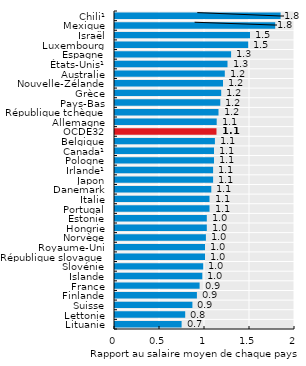
| Category | Series 0 |
|---|---|
| Lituanie | 0.74 |
| Lettonie | 0.78 |
| Suisse | 0.86 |
| Finlande | 0.91 |
| France | 0.94 |
| Islande | 0.97 |
| Slovénie | 0.98 |
| République slovaque | 1 |
| Royaume-Uni | 1 |
| Norvège | 1.01 |
| Hongrie | 1.02 |
| Estonie | 1.02 |
| Portugal | 1.05 |
| Italie | 1.05 |
| Danemark | 1.07 |
| Japon | 1.09 |
| Irlande¹ | 1.09 |
| Pologne | 1.1 |
| Canada¹ | 1.1 |
| Belgique | 1.11 |
| OCDE32 | 1.128 |
| Allemagne | 1.13 |
| République tchèque | 1.15 |
| Pays-Bas | 1.17 |
| Grèce | 1.18 |
| Nouvelle-Zélande | 1.2 |
| Australie | 1.22 |
| États-Unis¹ | 1.25 |
| Espagne | 1.29 |
| Luxembourg | 1.48 |
| Israël | 1.5 |
| Mexique | 1.78 |
| Chili¹ | 1.84 |